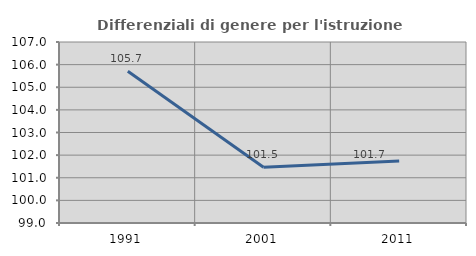
| Category | Differenziali di genere per l'istruzione superiore |
|---|---|
| 1991.0 | 105.708 |
| 2001.0 | 101.466 |
| 2011.0 | 101.738 |